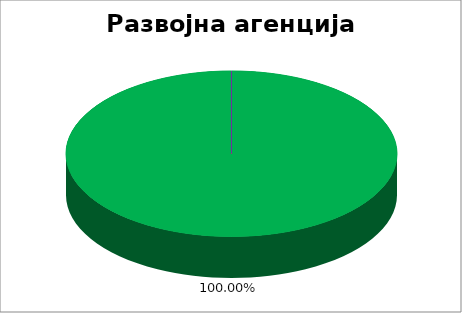
| Category | Развојна агенција Србије  |
|---|---|
| 0 | 1 |
| 1 | 0 |
| 2 | 0 |
| 3 | 0 |
| 4 | 0 |